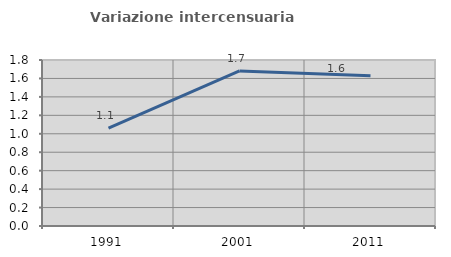
| Category | Variazione intercensuaria annua |
|---|---|
| 1991.0 | 1.063 |
| 2001.0 | 1.681 |
| 2011.0 | 1.629 |